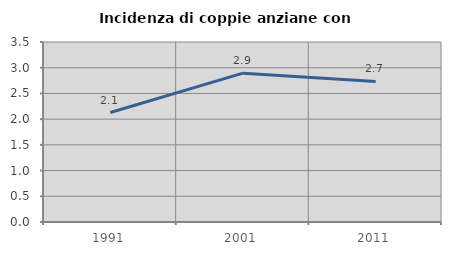
| Category | Incidenza di coppie anziane con figli |
|---|---|
| 1991.0 | 2.128 |
| 2001.0 | 2.894 |
| 2011.0 | 2.733 |